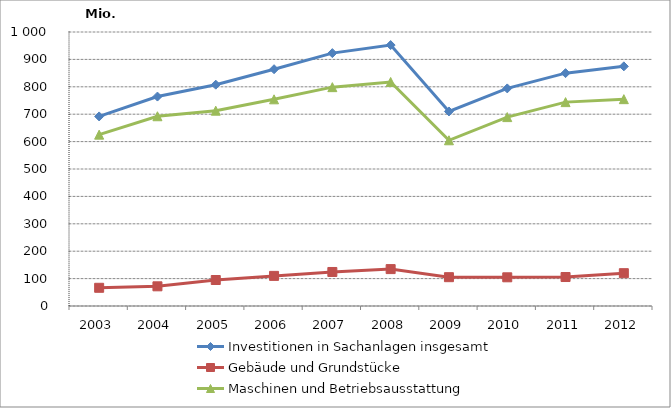
| Category | Investitionen in Sachanlagen insgesamt | Gebäude und Grundstücke | Maschinen und Betriebsausstattung |
|---|---|---|---|
| 2003.0 | 691.84 | 66.441 | 625.399 |
| 2004.0 | 764.337 | 71.81 | 692.527 |
| 2005.0 | 807.73 | 94.864 | 712.866 |
| 2006.0 | 864.202 | 109.907 | 754.295 |
| 2007.0 | 922.931 | 124.199 | 798.732 |
| 2008.0 | 952.284 | 134.649 | 817.635 |
| 2009.0 | 710.022 | 105.189 | 604.833 |
| 2010.0 | 794.111 | 104.71 | 689.4 |
| 2011.0 | 849.849 | 105.76 | 744.089 |
| 2012.0 | 874.648 | 119.797 | 754.851 |